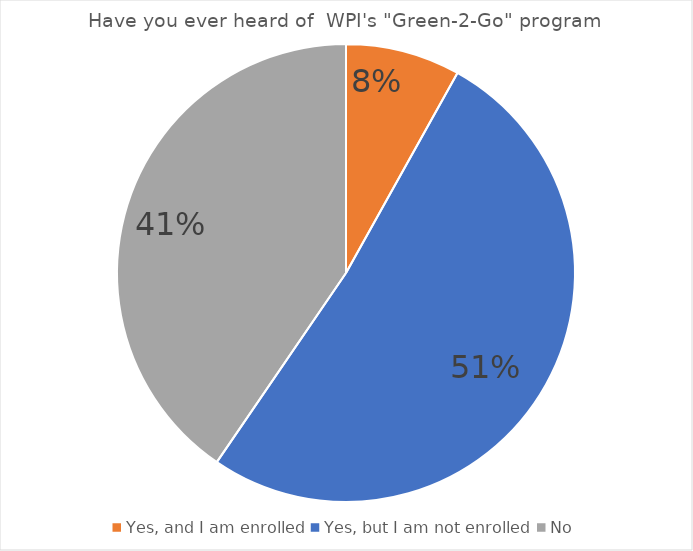
| Category | Series 0 |
|---|---|
| Yes, and I am enrolled | 28 |
| Yes, but I am not enrolled | 178 |
| No | 140 |